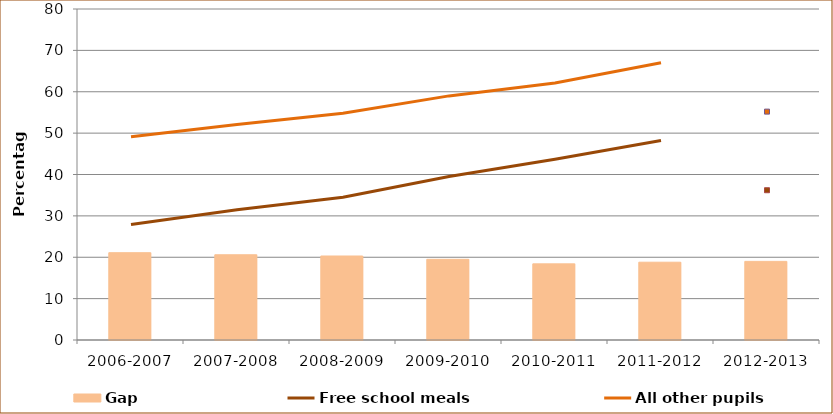
| Category | Gap |
|---|---|
| 2006-2007 | 21.1 |
| 2007-2008 | 20.6 |
| 2008-2009 | 20.3 |
| 2009-2010 | 19.5 |
| 2010-2011 | 18.4 |
| 2011-2012 | 18.8 |
| 2012-2013 | 19 |